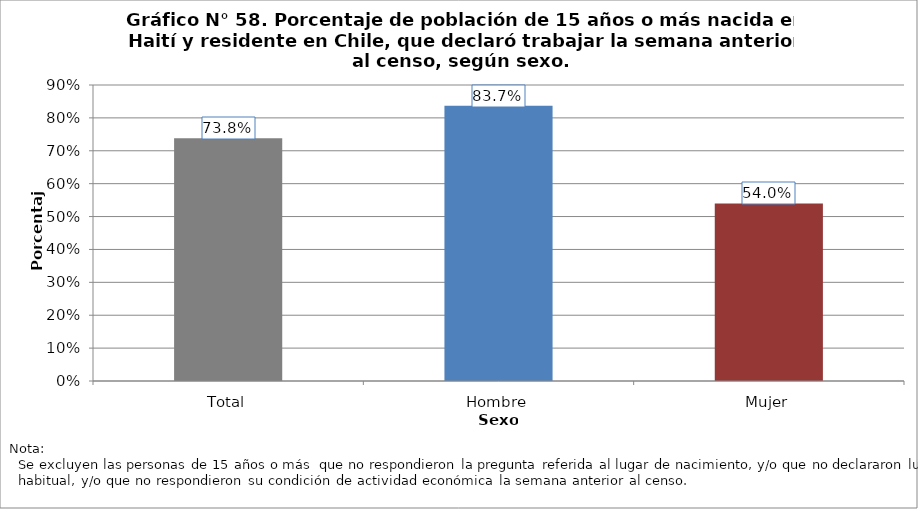
| Category | Población que declara trabajar  |
|---|---|
| Total | 0.738 |
| Hombre | 0.837 |
| Mujer | 0.54 |